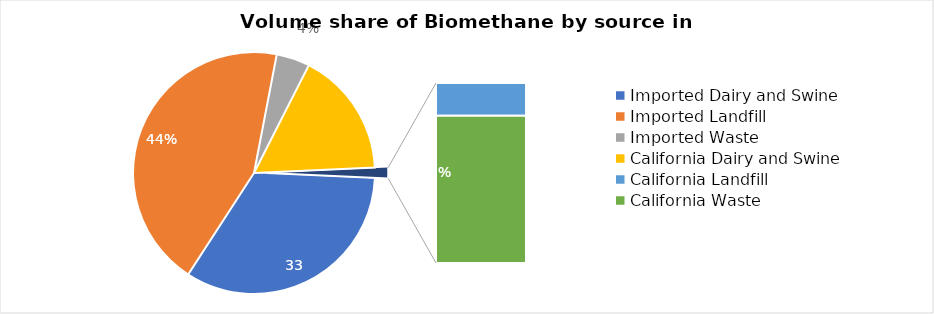
| Category | Series 0 |
|---|---|
| Imported Dairy and Swine | 68873022.588 |
| Imported Landfill | 90354441.201 |
| Imported Waste | 9197560.841 |
| California Dairy and Swine | 34603392.44 |
| California Landfill | 535337.942 |
| California Waste | 2405589.109 |